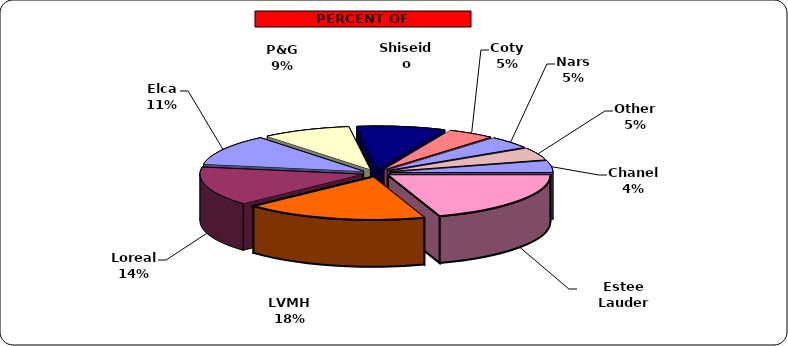
| Category | Series 0 |
|---|---|
| Estee Lauder | 330 |
| LVMH | 304 |
| Loreal | 241 |
| Elca | 190 |
| P&G | 147 |
| Shiseido | 147 |
| Coty | 78 |
| Nars | 77 |
| Other | 77 |
| Chanel | 72 |